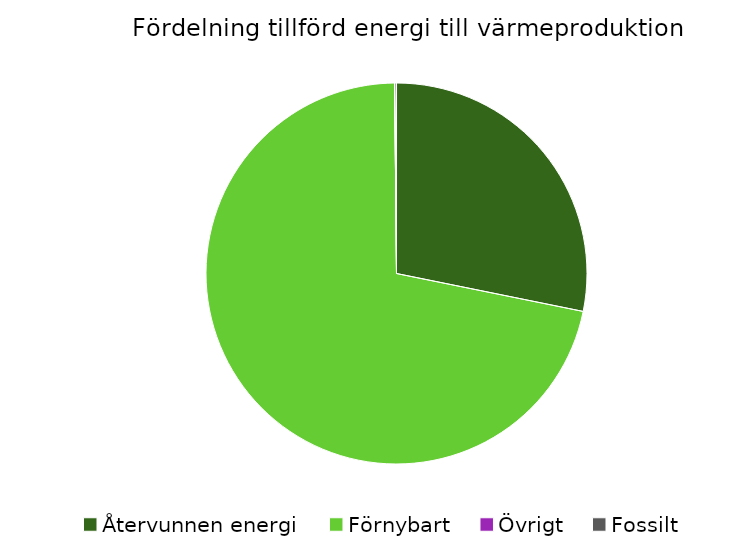
| Category | Fördelning värmeproduktion |
|---|---|
| Återvunnen energi | 0.282 |
| Förnybart | 0.717 |
| Övrigt | 0 |
| Fossilt | 0.002 |